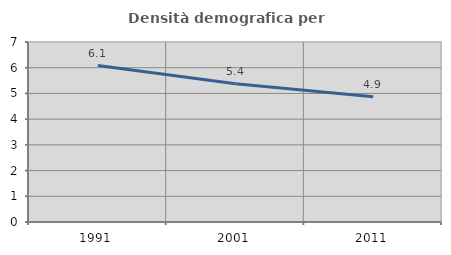
| Category | Densità demografica |
|---|---|
| 1991.0 | 6.084 |
| 2001.0 | 5.373 |
| 2011.0 | 4.873 |